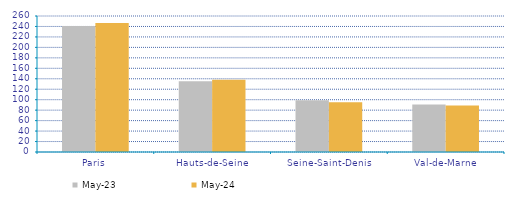
| Category | mai-23 | mai-24 |
|---|---|---|
| Paris | 240.685 | 246.682 |
| Hauts-de-Seine | 135.214 | 137.967 |
| Seine-Saint-Denis | 99.029 | 95.337 |
| Val-de-Marne | 90.719 | 88.772 |